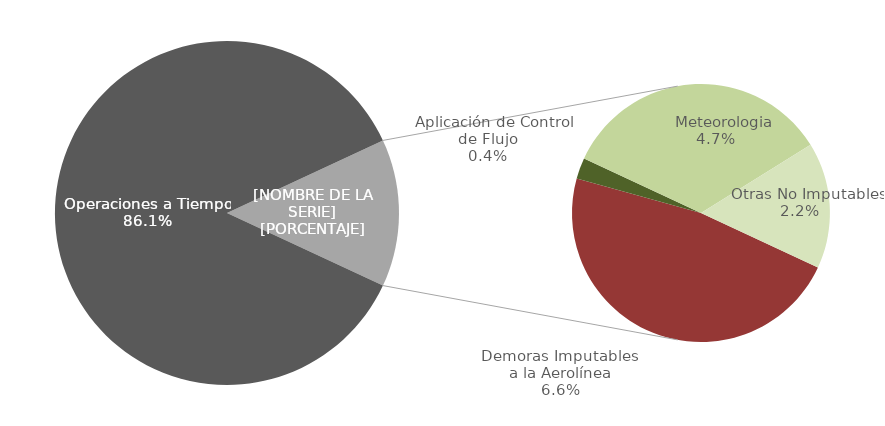
| Category | Demoras |
|---|---|
| Operaciones a Tiempo | 236 |
| Demoras Imputables 
a la Aerolínea | 18 |
|    Aplicación de Control 
de Flujo | 1 |
|    Repercusiones por un 
Tercero | 0 |
|    Meteorologia | 13 |
|    Otras No Imputables | 6 |